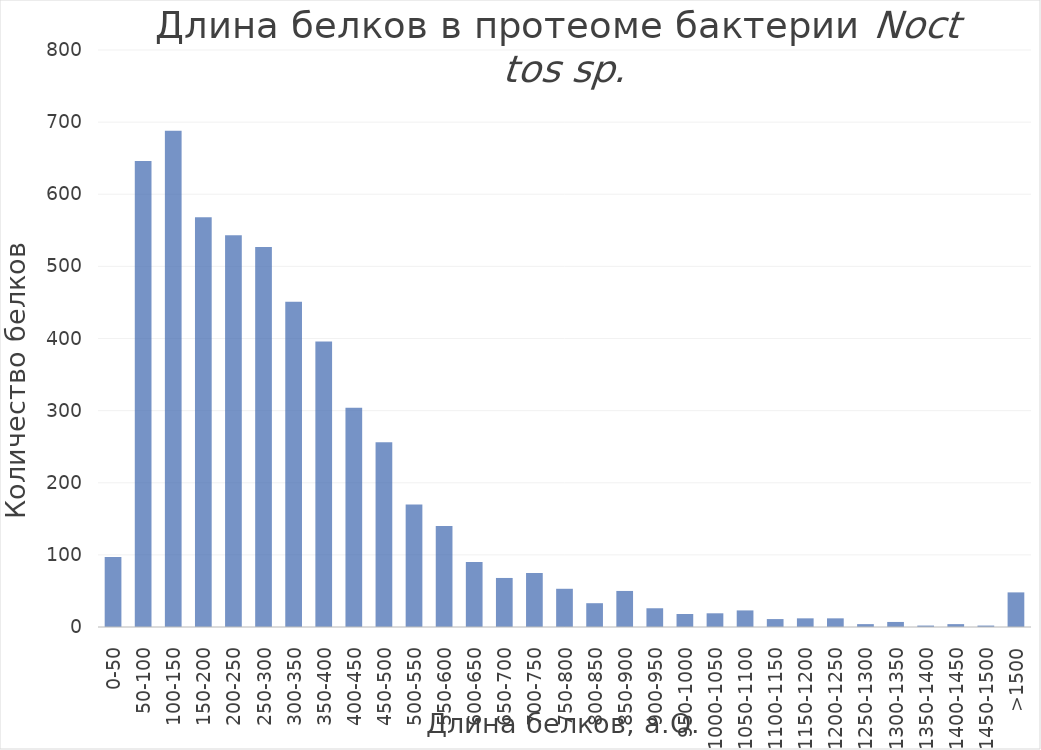
| Category | Proteins |
|---|---|
| 0-50 | 97 |
| 50-100 | 646 |
| 100-150 | 688 |
| 150-200 | 568 |
| 200-250 | 543 |
| 250-300 | 527 |
| 300-350 | 451 |
| 350-400 | 396 |
| 400-450 | 304 |
| 450-500 | 256 |
| 500-550 | 170 |
| 550-600 | 140 |
| 600-650 | 90 |
| 650-700 | 68 |
| 700-750 | 75 |
| 750-800 | 53 |
| 800-850 | 33 |
| 850-900 | 50 |
| 900-950 | 26 |
| 950-1000 | 18 |
| 1000-1050 | 19 |
| 1050-1100 | 23 |
| 1100-1150 | 11 |
| 1150-1200 | 12 |
| 1200-1250 | 12 |
| 1250-1300 | 4 |
| 1300-1350 | 7 |
| 1350-1400 | 2 |
| 1400-1450 | 4 |
| 1450-1500 | 2 |
| >1500 | 48 |